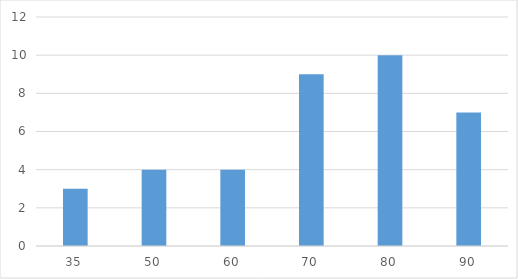
| Category | Series 0 |
|---|---|
| 35.0 | 3 |
| 50.0 | 4 |
| 60.0 | 4 |
| 70.0 | 9 |
| 80.0 | 10 |
| 90.0 | 7 |